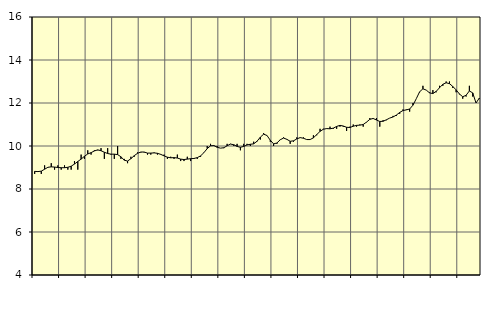
| Category | Piggar | Utbildning, SNI 85 |
|---|---|---|
| nan | 8.7 | 8.82 |
| 87.0 | 8.8 | 8.81 |
| 87.0 | 8.7 | 8.83 |
| 87.0 | 9.1 | 8.92 |
| nan | 9 | 9.01 |
| 88.0 | 9.2 | 9.03 |
| 88.0 | 8.9 | 9.02 |
| 88.0 | 9.1 | 9 |
| nan | 8.9 | 8.99 |
| 89.0 | 9.1 | 8.99 |
| 89.0 | 8.9 | 9.01 |
| 89.0 | 8.9 | 9.06 |
| nan | 9.3 | 9.16 |
| 90.0 | 8.9 | 9.28 |
| 90.0 | 9.6 | 9.39 |
| 90.0 | 9.4 | 9.52 |
| nan | 9.8 | 9.63 |
| 91.0 | 9.6 | 9.69 |
| 91.0 | 9.8 | 9.77 |
| 91.0 | 9.8 | 9.82 |
| nan | 9.9 | 9.78 |
| 92.0 | 9.4 | 9.71 |
| 92.0 | 9.9 | 9.65 |
| 92.0 | 9.6 | 9.62 |
| nan | 9.4 | 9.62 |
| 93.0 | 10 | 9.6 |
| 93.0 | 9.4 | 9.5 |
| 93.0 | 9.4 | 9.34 |
| nan | 9.2 | 9.3 |
| 94.0 | 9.5 | 9.41 |
| 94.0 | 9.5 | 9.55 |
| 94.0 | 9.7 | 9.66 |
| nan | 9.7 | 9.72 |
| 95.0 | 9.7 | 9.72 |
| 95.0 | 9.6 | 9.67 |
| 95.0 | 9.6 | 9.67 |
| nan | 9.7 | 9.68 |
| 96.0 | 9.6 | 9.66 |
| 96.0 | 9.6 | 9.61 |
| 96.0 | 9.6 | 9.54 |
| nan | 9.4 | 9.48 |
| 97.0 | 9.5 | 9.45 |
| 97.0 | 9.4 | 9.46 |
| 97.0 | 9.6 | 9.44 |
| nan | 9.3 | 9.39 |
| 98.0 | 9.3 | 9.37 |
| 98.0 | 9.5 | 9.39 |
| 98.0 | 9.3 | 9.41 |
| nan | 9.4 | 9.42 |
| 99.0 | 9.4 | 9.46 |
| 99.0 | 9.5 | 9.54 |
| 99.0 | 9.7 | 9.69 |
| nan | 10 | 9.88 |
| 0.0 | 10.1 | 10.01 |
| 0.0 | 10 | 10.02 |
| 0.0 | 10 | 9.94 |
| nan | 9.9 | 9.9 |
| 1.0 | 9.9 | 9.92 |
| 1.0 | 10.1 | 10.01 |
| 1.0 | 10.1 | 10.09 |
| nan | 10 | 10.06 |
| 2.0 | 10.1 | 9.98 |
| 2.0 | 9.8 | 9.94 |
| 2.0 | 10.1 | 9.98 |
| nan | 10.1 | 10.05 |
| 3.0 | 10 | 10.08 |
| 3.0 | 10.2 | 10.1 |
| 3.0 | 10.2 | 10.22 |
| nan | 10.3 | 10.41 |
| 4.0 | 10.6 | 10.55 |
| 4.0 | 10.5 | 10.49 |
| 4.0 | 10.2 | 10.27 |
| nan | 10 | 10.1 |
| 5.0 | 10.1 | 10.14 |
| 5.0 | 10.3 | 10.29 |
| 5.0 | 10.4 | 10.37 |
| nan | 10.3 | 10.31 |
| 6.0 | 10.1 | 10.22 |
| 6.0 | 10.2 | 10.24 |
| 6.0 | 10.4 | 10.33 |
| nan | 10.4 | 10.39 |
| 7.0 | 10.4 | 10.36 |
| 7.0 | 10.3 | 10.3 |
| 7.0 | 10.3 | 10.3 |
| nan | 10.5 | 10.38 |
| 8.0 | 10.5 | 10.53 |
| 8.0 | 10.8 | 10.68 |
| 8.0 | 10.8 | 10.78 |
| nan | 10.8 | 10.81 |
| 9.0 | 10.9 | 10.8 |
| 9.0 | 10.8 | 10.83 |
| 9.0 | 10.8 | 10.91 |
| nan | 10.9 | 10.96 |
| 10.0 | 10.9 | 10.93 |
| 10.0 | 10.7 | 10.87 |
| 10.0 | 10.9 | 10.86 |
| nan | 11 | 10.92 |
| 11.0 | 10.9 | 10.96 |
| 11.0 | 11 | 10.97 |
| 11.0 | 10.9 | 11 |
| nan | 11.1 | 11.11 |
| 12.0 | 11.3 | 11.24 |
| 12.0 | 11.3 | 11.28 |
| 12.0 | 11.3 | 11.21 |
| nan | 10.9 | 11.14 |
| 13.0 | 11.2 | 11.15 |
| 13.0 | 11.2 | 11.22 |
| 13.0 | 11.3 | 11.3 |
| nan | 11.4 | 11.35 |
| 14.0 | 11.4 | 11.44 |
| 14.0 | 11.5 | 11.56 |
| 14.0 | 11.7 | 11.65 |
| nan | 11.7 | 11.68 |
| 15.0 | 11.6 | 11.72 |
| 15.0 | 12 | 11.9 |
| 15.0 | 12.2 | 12.2 |
| nan | 12.5 | 12.52 |
| 16.0 | 12.8 | 12.66 |
| 16.0 | 12.6 | 12.6 |
| 16.0 | 12.5 | 12.47 |
| nan | 12.6 | 12.44 |
| 17.0 | 12.5 | 12.54 |
| 17.0 | 12.8 | 12.71 |
| 17.0 | 12.8 | 12.87 |
| nan | 13 | 12.94 |
| 18.0 | 13 | 12.9 |
| 18.0 | 12.7 | 12.77 |
| 18.0 | 12.5 | 12.61 |
| nan | 12.4 | 12.42 |
| 19.0 | 12.2 | 12.29 |
| 19.0 | 12.3 | 12.36 |
| 19.0 | 12.8 | 12.56 |
| nan | 12.3 | 12.47 |
| 20.0 | 12 | 12 |
| 20.0 | 12.2 | 12.23 |